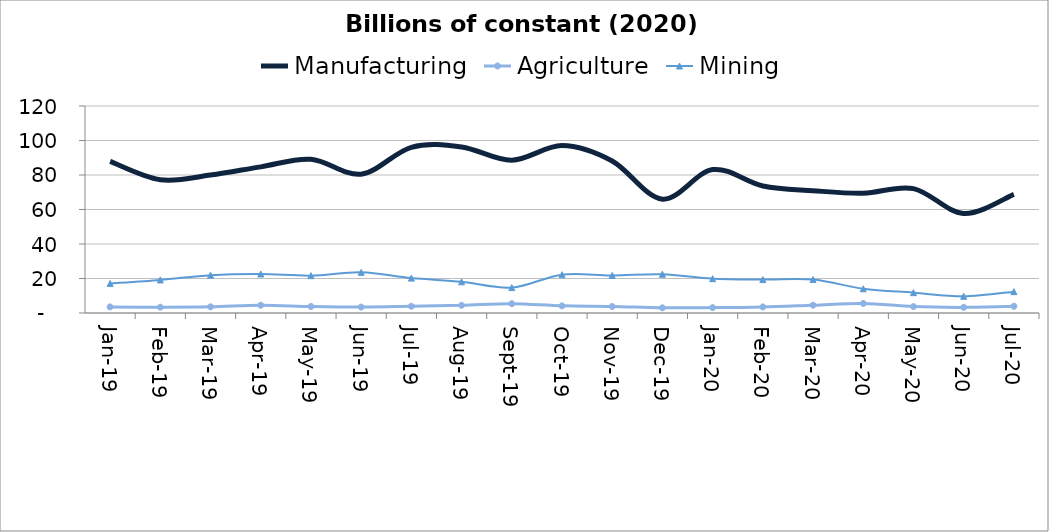
| Category | Manufacturing | Agriculture | Mining |
|---|---|---|---|
| 2019-01-31 | 87.914 | 3.527 | 17.144 |
| 2019-02-28 | 77.274 | 3.37 | 19.185 |
| 2019-03-31 | 79.983 | 3.58 | 21.938 |
| 2019-04-30 | 84.72 | 4.503 | 22.616 |
| 2019-05-31 | 89.128 | 3.781 | 21.663 |
| 2019-06-30 | 80.495 | 3.439 | 23.562 |
| 2019-07-31 | 96.057 | 3.905 | 20.232 |
| 2019-08-31 | 96.266 | 4.451 | 18.064 |
| 2019-09-30 | 88.601 | 5.39 | 14.714 |
| 2019-10-31 | 97.078 | 4.147 | 22.208 |
| 2019-11-30 | 88.11 | 3.78 | 21.774 |
| 2019-12-31 | 65.984 | 3.016 | 22.462 |
| 2020-01-31 | 83.135 | 3.122 | 19.886 |
| 2020-02-29 | 73.634 | 3.536 | 19.374 |
| 2020-03-31 | 70.907 | 4.519 | 19.431 |
| 2020-04-30 | 69.453 | 5.522 | 14.048 |
| 2020-05-31 | 72.111 | 3.713 | 11.8 |
| 2020-06-30 | 57.717 | 3.263 | 9.688 |
| 2020-07-31 | 68.788 | 3.902 | 12.376 |